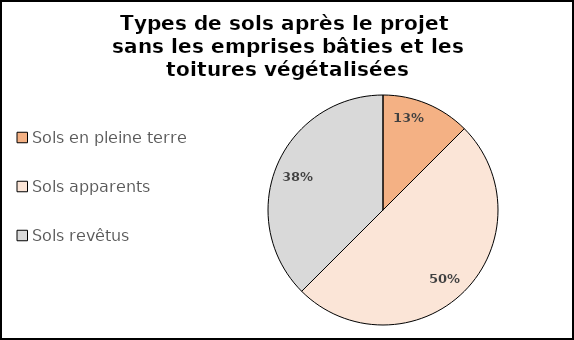
| Category | Series 0 |
|---|---|
| Sols en pleine terre | 5 |
| Sols apparents | 20 |
| Sols revêtus | 15 |